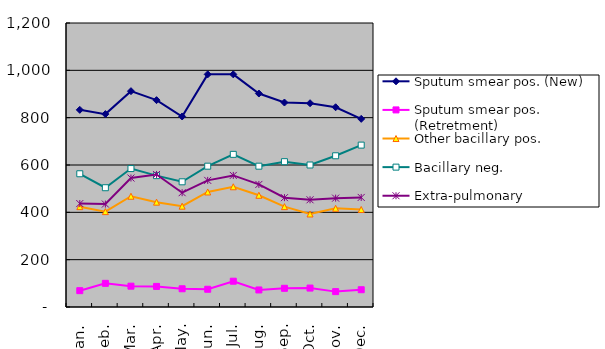
| Category | Sputum smear pos. (New) | Sputum smear pos. (Retretment) | Other bacillary pos. | Bacillary neg. | Extra-pulmonary |
|---|---|---|---|---|---|
| Jan. | 833 | 69 | 424 | 563 | 437 |
| Feb. | 815 | 100 | 403 | 504 | 435 |
| Mar. | 912 | 88 | 468 | 585 | 545 |
| Apr. | 874 | 87 | 443 | 555 | 560 |
| May. | 805 | 77 | 426 | 529 | 483 |
| Jun. | 983 | 75 | 486 | 595 | 535 |
| Jul. | 983 | 109 | 508 | 645 | 556 |
| Aug. | 902 | 72 | 472 | 595 | 518 |
| Sep. | 864 | 79 | 424 | 614 | 462 |
| Oct. | 861 | 80 | 393 | 600 | 453 |
| Nov. | 844 | 65 | 417 | 639 | 460 |
| Dec. | 795 | 73 | 412 | 684 | 463 |